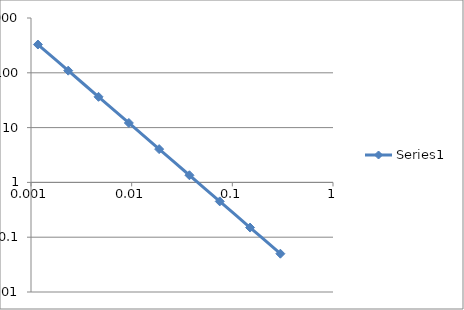
| Category | Series 0 |
|---|---|
| 0.3 | 0.05 |
| 0.15 | 0.15 |
| 0.075 | 0.45 |
| 0.0375 | 1.35 |
| 0.01875 | 4.05 |
| 0.009375 | 12.15 |
| 0.0046875 | 36.45 |
| 0.00234375 | 109.35 |
| 0.001171875 | 328.05 |